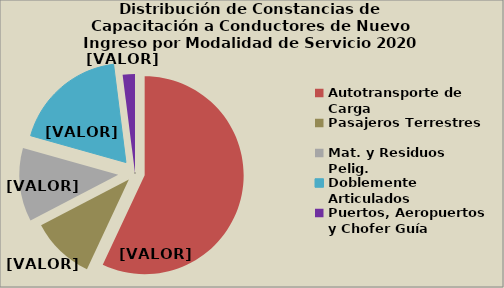
| Category | Series 0 |
|---|---|
| Autotransporte de Carga | 56.957 |
| Pasajeros Terrestres | 10.388 |
| Mat. y Residuos Pelig. | 12.016 |
| Doblemente Articulados | 18.64 |
| Puertos, Aeropuertos y Chofer Guía | 1.999 |